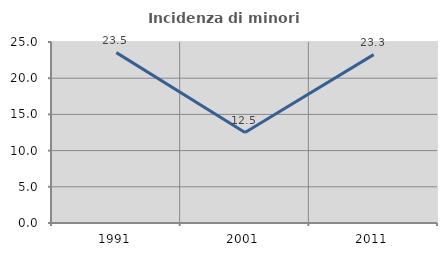
| Category | Incidenza di minori stranieri |
|---|---|
| 1991.0 | 23.529 |
| 2001.0 | 12.5 |
| 2011.0 | 23.256 |